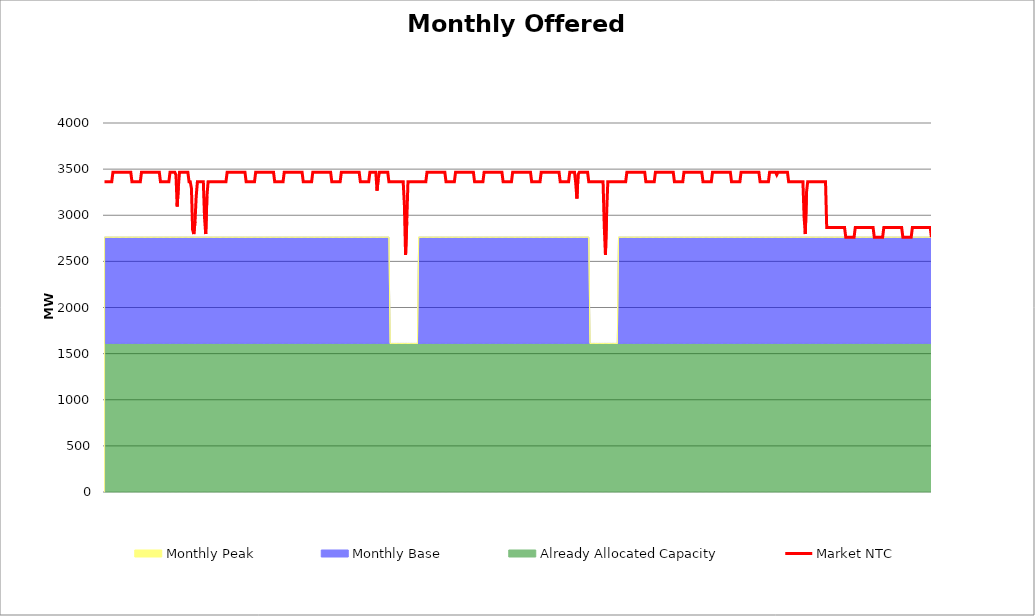
| Category | Market NTC |
|---|---|
| 0 | 3362 |
| 1 | 3362 |
| 2 | 3362 |
| 3 | 3362 |
| 4 | 3362 |
| 5 | 3362 |
| 6 | 3362 |
| 7 | 3466 |
| 8 | 3466 |
| 9 | 3466 |
| 10 | 3466 |
| 11 | 3466 |
| 12 | 3466 |
| 13 | 3466 |
| 14 | 3466 |
| 15 | 3466 |
| 16 | 3466 |
| 17 | 3466 |
| 18 | 3466 |
| 19 | 3466 |
| 20 | 3466 |
| 21 | 3466 |
| 22 | 3466 |
| 23 | 3362 |
| 24 | 3362 |
| 25 | 3362 |
| 26 | 3362 |
| 27 | 3362 |
| 28 | 3362 |
| 29 | 3362 |
| 30 | 3362 |
| 31 | 3466 |
| 32 | 3466 |
| 33 | 3466 |
| 34 | 3466 |
| 35 | 3466 |
| 36 | 3466 |
| 37 | 3466 |
| 38 | 3466 |
| 39 | 3466 |
| 40 | 3466 |
| 41 | 3466 |
| 42 | 3466 |
| 43 | 3466 |
| 44 | 3466 |
| 45 | 3466 |
| 46 | 3466 |
| 47 | 3362 |
| 48 | 3362 |
| 49 | 3362 |
| 50 | 3362 |
| 51 | 3362 |
| 52 | 3362 |
| 53 | 3362 |
| 54 | 3362 |
| 55 | 3466 |
| 56 | 3466 |
| 57 | 3466 |
| 58 | 3466 |
| 59 | 3466 |
| 60 | 3438 |
| 61 | 3095 |
| 62 | 3309 |
| 63 | 3466 |
| 64 | 3466 |
| 65 | 3466 |
| 66 | 3466 |
| 67 | 3466 |
| 68 | 3466 |
| 69 | 3466 |
| 70 | 3466 |
| 71 | 3362 |
| 72 | 3362 |
| 73 | 3292 |
| 74 | 2841 |
| 75 | 2796 |
| 76 | 2931 |
| 77 | 3202 |
| 78 | 3362 |
| 79 | 3362 |
| 80 | 3362 |
| 81 | 3362 |
| 82 | 3362 |
| 83 | 3362 |
| 84 | 2976 |
| 85 | 2796 |
| 86 | 3202 |
| 87 | 3362 |
| 88 | 3362 |
| 89 | 3362 |
| 90 | 3362 |
| 91 | 3362 |
| 92 | 3362 |
| 93 | 3362 |
| 94 | 3362 |
| 95 | 3362 |
| 96 | 3362 |
| 97 | 3362 |
| 98 | 3362 |
| 99 | 3362 |
| 100 | 3362 |
| 101 | 3362 |
| 102 | 3362 |
| 103 | 3466 |
| 104 | 3466 |
| 105 | 3466 |
| 106 | 3466 |
| 107 | 3466 |
| 108 | 3466 |
| 109 | 3466 |
| 110 | 3466 |
| 111 | 3466 |
| 112 | 3466 |
| 113 | 3466 |
| 114 | 3466 |
| 115 | 3466 |
| 116 | 3466 |
| 117 | 3466 |
| 118 | 3466 |
| 119 | 3362 |
| 120 | 3362 |
| 121 | 3362 |
| 122 | 3362 |
| 123 | 3362 |
| 124 | 3362 |
| 125 | 3362 |
| 126 | 3362 |
| 127 | 3466 |
| 128 | 3466 |
| 129 | 3466 |
| 130 | 3466 |
| 131 | 3466 |
| 132 | 3466 |
| 133 | 3466 |
| 134 | 3466 |
| 135 | 3466 |
| 136 | 3466 |
| 137 | 3466 |
| 138 | 3466 |
| 139 | 3466 |
| 140 | 3466 |
| 141 | 3466 |
| 142 | 3466 |
| 143 | 3362 |
| 144 | 3362 |
| 145 | 3362 |
| 146 | 3362 |
| 147 | 3362 |
| 148 | 3362 |
| 149 | 3362 |
| 150 | 3362 |
| 151 | 3466 |
| 152 | 3466 |
| 153 | 3466 |
| 154 | 3466 |
| 155 | 3466 |
| 156 | 3466 |
| 157 | 3466 |
| 158 | 3466 |
| 159 | 3466 |
| 160 | 3466 |
| 161 | 3466 |
| 162 | 3466 |
| 163 | 3466 |
| 164 | 3466 |
| 165 | 3466 |
| 166 | 3466 |
| 167 | 3362 |
| 168 | 3362 |
| 169 | 3362 |
| 170 | 3362 |
| 171 | 3362 |
| 172 | 3362 |
| 173 | 3362 |
| 174 | 3362 |
| 175 | 3466 |
| 176 | 3466 |
| 177 | 3466 |
| 178 | 3466 |
| 179 | 3466 |
| 180 | 3466 |
| 181 | 3466 |
| 182 | 3466 |
| 183 | 3466 |
| 184 | 3466 |
| 185 | 3466 |
| 186 | 3466 |
| 187 | 3466 |
| 188 | 3466 |
| 189 | 3466 |
| 190 | 3466 |
| 191 | 3362 |
| 192 | 3362 |
| 193 | 3362 |
| 194 | 3362 |
| 195 | 3362 |
| 196 | 3362 |
| 197 | 3362 |
| 198 | 3362 |
| 199 | 3466 |
| 200 | 3466 |
| 201 | 3466 |
| 202 | 3466 |
| 203 | 3466 |
| 204 | 3466 |
| 205 | 3466 |
| 206 | 3466 |
| 207 | 3466 |
| 208 | 3466 |
| 209 | 3466 |
| 210 | 3466 |
| 211 | 3466 |
| 212 | 3466 |
| 213 | 3466 |
| 214 | 3466 |
| 215 | 3362 |
| 216 | 3362 |
| 217 | 3362 |
| 218 | 3362 |
| 219 | 3362 |
| 220 | 3362 |
| 221 | 3362 |
| 222 | 3362 |
| 223 | 3466 |
| 224 | 3466 |
| 225 | 3466 |
| 226 | 3466 |
| 227 | 3466 |
| 228 | 3466 |
| 229 | 3267 |
| 230 | 3395 |
| 231 | 3466 |
| 232 | 3466 |
| 233 | 3466 |
| 234 | 3466 |
| 235 | 3466 |
| 236 | 3466 |
| 237 | 3466 |
| 238 | 3466 |
| 239 | 3362 |
| 240 | 3362 |
| 241 | 3362 |
| 242 | 3362 |
| 243 | 3362 |
| 244 | 3362 |
| 245 | 3362 |
| 246 | 3362 |
| 247 | 3362 |
| 248 | 3362 |
| 249 | 3362 |
| 250 | 3362 |
| 251 | 3362 |
| 252 | 3111 |
| 253 | 2570 |
| 254 | 2931 |
| 255 | 3362 |
| 256 | 3362 |
| 257 | 3362 |
| 258 | 3362 |
| 259 | 3362 |
| 260 | 3362 |
| 261 | 3362 |
| 262 | 3362 |
| 263 | 3362 |
| 264 | 3362 |
| 265 | 3362 |
| 266 | 3362 |
| 267 | 3362 |
| 268 | 3362 |
| 269 | 3362 |
| 270 | 3362 |
| 271 | 3466 |
| 272 | 3466 |
| 273 | 3466 |
| 274 | 3466 |
| 275 | 3466 |
| 276 | 3466 |
| 277 | 3466 |
| 278 | 3466 |
| 279 | 3466 |
| 280 | 3466 |
| 281 | 3466 |
| 282 | 3466 |
| 283 | 3466 |
| 284 | 3466 |
| 285 | 3466 |
| 286 | 3466 |
| 287 | 3362 |
| 288 | 3362 |
| 289 | 3362 |
| 290 | 3362 |
| 291 | 3362 |
| 292 | 3362 |
| 293 | 3362 |
| 294 | 3362 |
| 295 | 3466 |
| 296 | 3466 |
| 297 | 3466 |
| 298 | 3466 |
| 299 | 3466 |
| 300 | 3466 |
| 301 | 3466 |
| 302 | 3466 |
| 303 | 3466 |
| 304 | 3466 |
| 305 | 3466 |
| 306 | 3466 |
| 307 | 3466 |
| 308 | 3466 |
| 309 | 3466 |
| 310 | 3466 |
| 311 | 3362 |
| 312 | 3362 |
| 313 | 3362 |
| 314 | 3362 |
| 315 | 3362 |
| 316 | 3362 |
| 317 | 3362 |
| 318 | 3362 |
| 319 | 3466 |
| 320 | 3466 |
| 321 | 3466 |
| 322 | 3466 |
| 323 | 3466 |
| 324 | 3466 |
| 325 | 3466 |
| 326 | 3466 |
| 327 | 3466 |
| 328 | 3466 |
| 329 | 3466 |
| 330 | 3466 |
| 331 | 3466 |
| 332 | 3466 |
| 333 | 3466 |
| 334 | 3466 |
| 335 | 3362 |
| 336 | 3362 |
| 337 | 3362 |
| 338 | 3362 |
| 339 | 3362 |
| 340 | 3362 |
| 341 | 3362 |
| 342 | 3362 |
| 343 | 3466 |
| 344 | 3466 |
| 345 | 3466 |
| 346 | 3466 |
| 347 | 3466 |
| 348 | 3466 |
| 349 | 3466 |
| 350 | 3466 |
| 351 | 3466 |
| 352 | 3466 |
| 353 | 3466 |
| 354 | 3466 |
| 355 | 3466 |
| 356 | 3466 |
| 357 | 3466 |
| 358 | 3466 |
| 359 | 3362 |
| 360 | 3362 |
| 361 | 3362 |
| 362 | 3362 |
| 363 | 3362 |
| 364 | 3362 |
| 365 | 3362 |
| 366 | 3362 |
| 367 | 3466 |
| 368 | 3466 |
| 369 | 3466 |
| 370 | 3466 |
| 371 | 3466 |
| 372 | 3466 |
| 373 | 3466 |
| 374 | 3466 |
| 375 | 3466 |
| 376 | 3466 |
| 377 | 3466 |
| 378 | 3466 |
| 379 | 3466 |
| 380 | 3466 |
| 381 | 3466 |
| 382 | 3466 |
| 383 | 3362 |
| 384 | 3362 |
| 385 | 3362 |
| 386 | 3362 |
| 387 | 3362 |
| 388 | 3362 |
| 389 | 3362 |
| 390 | 3362 |
| 391 | 3466 |
| 392 | 3466 |
| 393 | 3466 |
| 394 | 3466 |
| 395 | 3466 |
| 396 | 3352 |
| 397 | 3181 |
| 398 | 3438 |
| 399 | 3466 |
| 400 | 3466 |
| 401 | 3466 |
| 402 | 3466 |
| 403 | 3466 |
| 404 | 3466 |
| 405 | 3466 |
| 406 | 3466 |
| 407 | 3362 |
| 408 | 3362 |
| 409 | 3362 |
| 410 | 3362 |
| 411 | 3362 |
| 412 | 3362 |
| 413 | 3362 |
| 414 | 3362 |
| 415 | 3362 |
| 416 | 3362 |
| 417 | 3362 |
| 418 | 3362 |
| 419 | 3362 |
| 420 | 2886 |
| 421 | 2570 |
| 422 | 3021 |
| 423 | 3362 |
| 424 | 3362 |
| 425 | 3362 |
| 426 | 3362 |
| 427 | 3362 |
| 428 | 3362 |
| 429 | 3362 |
| 430 | 3362 |
| 431 | 3362 |
| 432 | 3362 |
| 433 | 3362 |
| 434 | 3362 |
| 435 | 3362 |
| 436 | 3362 |
| 437 | 3362 |
| 438 | 3362 |
| 439 | 3466 |
| 440 | 3466 |
| 441 | 3466 |
| 442 | 3466 |
| 443 | 3466 |
| 444 | 3466 |
| 445 | 3466 |
| 446 | 3466 |
| 447 | 3466 |
| 448 | 3466 |
| 449 | 3466 |
| 450 | 3466 |
| 451 | 3466 |
| 452 | 3466 |
| 453 | 3466 |
| 454 | 3466 |
| 455 | 3362 |
| 456 | 3362 |
| 457 | 3362 |
| 458 | 3362 |
| 459 | 3362 |
| 460 | 3362 |
| 461 | 3362 |
| 462 | 3362 |
| 463 | 3466 |
| 464 | 3466 |
| 465 | 3466 |
| 466 | 3466 |
| 467 | 3466 |
| 468 | 3466 |
| 469 | 3466 |
| 470 | 3466 |
| 471 | 3466 |
| 472 | 3466 |
| 473 | 3466 |
| 474 | 3466 |
| 475 | 3466 |
| 476 | 3466 |
| 477 | 3466 |
| 478 | 3466 |
| 479 | 3362 |
| 480 | 3362 |
| 481 | 3362 |
| 482 | 3362 |
| 483 | 3362 |
| 484 | 3362 |
| 485 | 3362 |
| 486 | 3362 |
| 487 | 3466 |
| 488 | 3466 |
| 489 | 3466 |
| 490 | 3466 |
| 491 | 3466 |
| 492 | 3466 |
| 493 | 3466 |
| 494 | 3466 |
| 495 | 3466 |
| 496 | 3466 |
| 497 | 3466 |
| 498 | 3466 |
| 499 | 3466 |
| 500 | 3466 |
| 501 | 3466 |
| 502 | 3466 |
| 503 | 3362 |
| 504 | 3362 |
| 505 | 3362 |
| 506 | 3362 |
| 507 | 3362 |
| 508 | 3362 |
| 509 | 3362 |
| 510 | 3362 |
| 511 | 3466 |
| 512 | 3466 |
| 513 | 3466 |
| 514 | 3466 |
| 515 | 3466 |
| 516 | 3466 |
| 517 | 3466 |
| 518 | 3466 |
| 519 | 3466 |
| 520 | 3466 |
| 521 | 3466 |
| 522 | 3466 |
| 523 | 3466 |
| 524 | 3466 |
| 525 | 3466 |
| 526 | 3466 |
| 527 | 3362 |
| 528 | 3362 |
| 529 | 3362 |
| 530 | 3362 |
| 531 | 3362 |
| 532 | 3362 |
| 533 | 3362 |
| 534 | 3362 |
| 535 | 3466 |
| 536 | 3466 |
| 537 | 3466 |
| 538 | 3466 |
| 539 | 3466 |
| 540 | 3466 |
| 541 | 3466 |
| 542 | 3466 |
| 543 | 3466 |
| 544 | 3466 |
| 545 | 3466 |
| 546 | 3466 |
| 547 | 3466 |
| 548 | 3466 |
| 549 | 3466 |
| 550 | 3466 |
| 551 | 3362 |
| 552 | 3362 |
| 553 | 3362 |
| 554 | 3362 |
| 555 | 3362 |
| 556 | 3362 |
| 557 | 3362 |
| 558 | 3362 |
| 559 | 3466 |
| 560 | 3466 |
| 561 | 3466 |
| 562 | 3466 |
| 563 | 3466 |
| 564 | 3466 |
| 565 | 3438 |
| 566 | 3466 |
| 567 | 3466 |
| 568 | 3466 |
| 569 | 3466 |
| 570 | 3466 |
| 571 | 3466 |
| 572 | 3466 |
| 573 | 3466 |
| 574 | 3466 |
| 575 | 3362 |
| 576 | 3362 |
| 577 | 3362 |
| 578 | 3362 |
| 579 | 3362 |
| 580 | 3362 |
| 581 | 3362 |
| 582 | 3362 |
| 583 | 3362 |
| 584 | 3362 |
| 585 | 3362 |
| 586 | 3362 |
| 587 | 3362 |
| 588 | 2976 |
| 589 | 2796 |
| 590 | 3247 |
| 591 | 3362 |
| 592 | 3362 |
| 593 | 3362 |
| 594 | 3362 |
| 595 | 3362 |
| 596 | 3362 |
| 597 | 3362 |
| 598 | 3362 |
| 599 | 3362 |
| 600 | 3362 |
| 601 | 3362 |
| 602 | 3362 |
| 603 | 3362 |
| 604 | 3362 |
| 605 | 3362 |
| 606 | 3362 |
| 607 | 2866 |
| 608 | 2866 |
| 609 | 2866 |
| 610 | 2866 |
| 611 | 2866 |
| 612 | 2866 |
| 613 | 2866 |
| 614 | 2866 |
| 615 | 2866 |
| 616 | 2866 |
| 617 | 2866 |
| 618 | 2866 |
| 619 | 2866 |
| 620 | 2866 |
| 621 | 2866 |
| 622 | 2866 |
| 623 | 2762 |
| 624 | 2762 |
| 625 | 2762 |
| 626 | 2762 |
| 627 | 2762 |
| 628 | 2762 |
| 629 | 2762 |
| 630 | 2762 |
| 631 | 2866 |
| 632 | 2866 |
| 633 | 2866 |
| 634 | 2866 |
| 635 | 2866 |
| 636 | 2866 |
| 637 | 2866 |
| 638 | 2866 |
| 639 | 2866 |
| 640 | 2866 |
| 641 | 2866 |
| 642 | 2866 |
| 643 | 2866 |
| 644 | 2866 |
| 645 | 2866 |
| 646 | 2866 |
| 647 | 2762 |
| 648 | 2762 |
| 649 | 2762 |
| 650 | 2762 |
| 651 | 2762 |
| 652 | 2762 |
| 653 | 2762 |
| 654 | 2762 |
| 655 | 2866 |
| 656 | 2866 |
| 657 | 2866 |
| 658 | 2866 |
| 659 | 2866 |
| 660 | 2866 |
| 661 | 2866 |
| 662 | 2866 |
| 663 | 2866 |
| 664 | 2866 |
| 665 | 2866 |
| 666 | 2866 |
| 667 | 2866 |
| 668 | 2866 |
| 669 | 2866 |
| 670 | 2866 |
| 671 | 2762 |
| 672 | 2762 |
| 673 | 2762 |
| 674 | 2762 |
| 675 | 2762 |
| 676 | 2762 |
| 677 | 2762 |
| 678 | 2762 |
| 679 | 2866 |
| 680 | 2866 |
| 681 | 2866 |
| 682 | 2866 |
| 683 | 2866 |
| 684 | 2866 |
| 685 | 2866 |
| 686 | 2866 |
| 687 | 2866 |
| 688 | 2866 |
| 689 | 2866 |
| 690 | 2866 |
| 691 | 2866 |
| 692 | 2866 |
| 693 | 2866 |
| 694 | 2866 |
| 695 | 2762 |